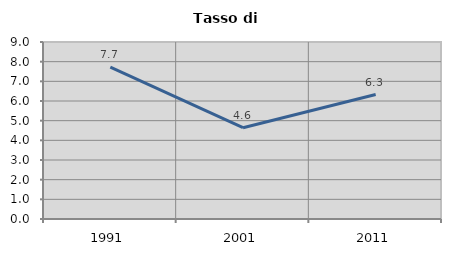
| Category | Tasso di disoccupazione   |
|---|---|
| 1991.0 | 7.724 |
| 2001.0 | 4.641 |
| 2011.0 | 6.329 |